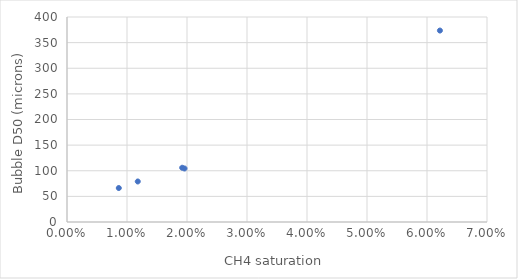
| Category | Series 0 |
|---|---|
| 0.06215328400276559 | 373.56 |
| 0.019588667645420728 | 104.419 |
| 0.019198889813149475 | 105.869 |
| 0.011794096149502132 | 79.067 |
| 0.008631637122717162 | 66.276 |